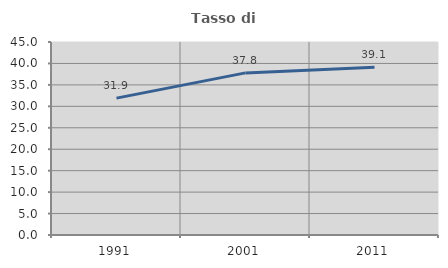
| Category | Tasso di occupazione   |
|---|---|
| 1991.0 | 31.909 |
| 2001.0 | 37.798 |
| 2011.0 | 39.091 |